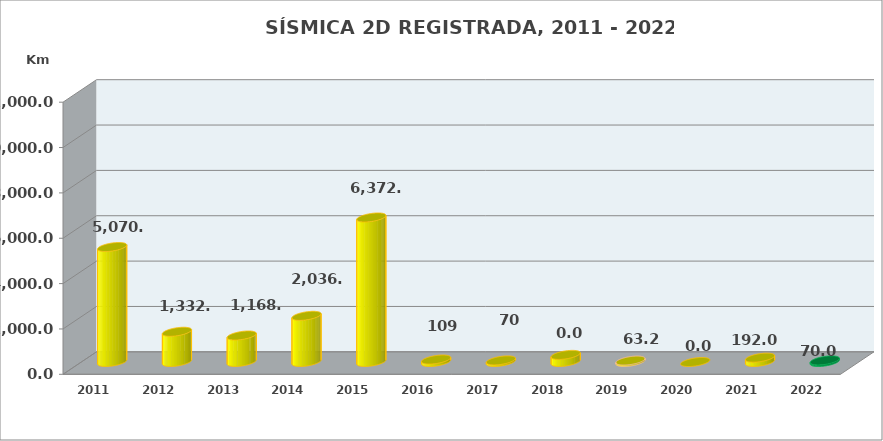
| Category | Series 0 |
|---|---|
| 2011.0 | 5070.18 |
| 2012.0 | 1332.85 |
| 2013.0 | 1168 |
| 2014.0 | 2036 |
| 2015.0 | 6372.61 |
| 2016.0 | 109 |
| 2017.0 | 70 |
| 2018.0 | 313.4 |
| 2019.0 | 63.22 |
| 2020.0 | 0 |
| 2021.0 | 191.95 |
| 2022.0 | 70 |